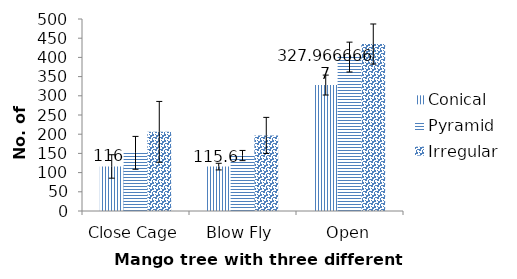
| Category | Conical | Pyramid | Irregular |
|---|---|---|---|
| Close Cage | 116 | 151.467 | 206.133 |
| Blow Fly | 115.6 | 144.433 | 196.8 |
| Open | 327.967 | 400.9 | 434.8 |